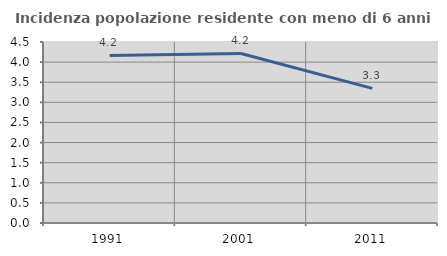
| Category | Incidenza popolazione residente con meno di 6 anni |
|---|---|
| 1991.0 | 4.167 |
| 2001.0 | 4.215 |
| 2011.0 | 3.348 |